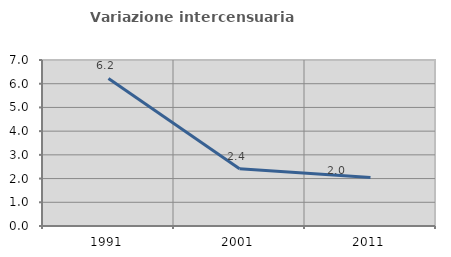
| Category | Variazione intercensuaria annua |
|---|---|
| 1991.0 | 6.221 |
| 2001.0 | 2.415 |
| 2011.0 | 2.048 |